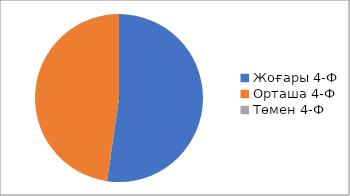
| Category | Series 0 |
|---|---|
| 0 | 4.356 |
| 1 | 3.977 |
| 2 | 0 |